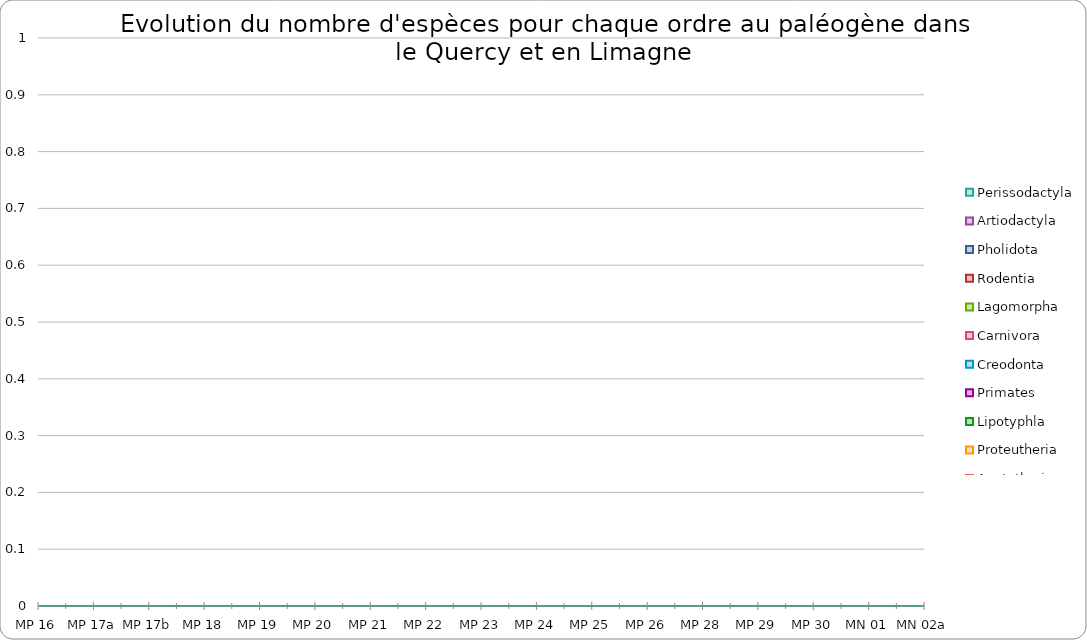
| Category | Didelphimorphia | Apatotheria | Proteutheria | Lipotyphla | Primates | Creodonta | Carnivora | Lagomorpha | Rodentia | Pholidota | Artiodactyla | Perissodactyla |
|---|---|---|---|---|---|---|---|---|---|---|---|---|
| MP 16 | 0 | 0 | 0 | 0 | 0 | 0 | 0 | 0 | 0 | 0 | 0 | 0 |
| MP 17a | 0 | 0 | 0 | 0 | 0 | 0 | 0 | 0 | 0 | 0 | 0 | 0 |
| MP 17b | 0 | 0 | 0 | 0 | 0 | 0 | 0 | 0 | 0 | 0 | 0 | 0 |
| MP 18 | 0 | 0 | 0 | 0 | 0 | 0 | 0 | 0 | 0 | 0 | 0 | 0 |
| MP 19 | 0 | 0 | 0 | 0 | 0 | 0 | 0 | 0 | 0 | 0 | 0 | 0 |
| MP 20 | 0 | 0 | 0 | 0 | 0 | 0 | 0 | 0 | 0 | 0 | 0 | 0 |
| MP 21 | 0 | 0 | 0 | 0 | 0 | 0 | 0 | 0 | 0 | 0 | 0 | 0 |
| MP 22 | 0 | 0 | 0 | 0 | 0 | 0 | 0 | 0 | 0 | 0 | 0 | 0 |
| MP 23 | 0 | 0 | 0 | 0 | 0 | 0 | 0 | 0 | 0 | 0 | 0 | 0 |
| MP 24 | 0 | 0 | 0 | 0 | 0 | 0 | 0 | 0 | 0 | 0 | 0 | 0 |
| MP 25 | 0 | 0 | 0 | 0 | 0 | 0 | 0 | 0 | 0 | 0 | 0 | 0 |
| MP 26 | 0 | 0 | 0 | 0 | 0 | 0 | 0 | 0 | 0 | 0 | 0 | 0 |
| MP 28 | 0 | 0 | 0 | 0 | 0 | 0 | 0 | 0 | 0 | 0 | 0 | 0 |
| MP 29 | 0 | 0 | 0 | 0 | 0 | 0 | 0 | 0 | 0 | 0 | 0 | 0 |
| MP 30 | 0 | 0 | 0 | 0 | 0 | 0 | 0 | 0 | 0 | 0 | 0 | 0 |
| MN 01 | 0 | 0 | 0 | 0 | 0 | 0 | 0 | 0 | 0 | 0 | 0 | 0 |
| MN 02a | 0 | 0 | 0 | 0 | 0 | 0 | 0 | 0 | 0 | 0 | 0 | 0 |